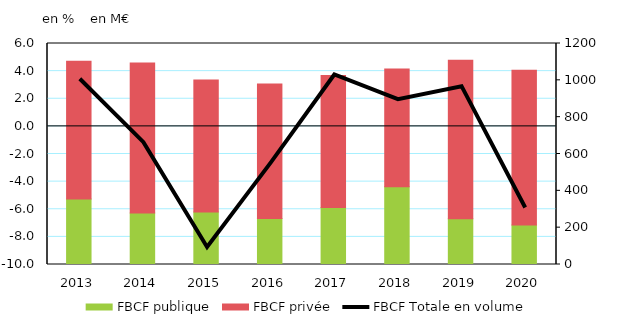
| Category | FBCF publique | FBCF privée |
|---|---|---|
| 2013.0 | 356.161 | 747.577 |
| 2014.0 | 279.772 | 814.859 |
| 2015.0 | 285.074 | 716.211 |
| 2016.0 | 249.108 | 731.122 |
| 2017.0 | 310.019 | 716.839 |
| 2018.0 | 422.436 | 639.434 |
| 2019.0 | 247.841 | 861.813 |
| 2020.0 | 214.501 | 839.67 |